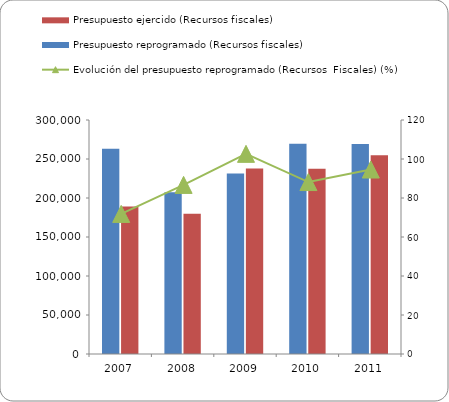
| Category | Presupuesto reprogramado (Recursos fiscales) | Presupuesto ejercido (Recursos fiscales)  |
|---|---|---|
| 2007 | 263026 | 188945 |
| 2008 | 207337 | 179800 |
| 2009 | 231553 | 237668 |
| 2010 | 269511 | 237655 |
| 2011 | 269343 | 254816.8 |